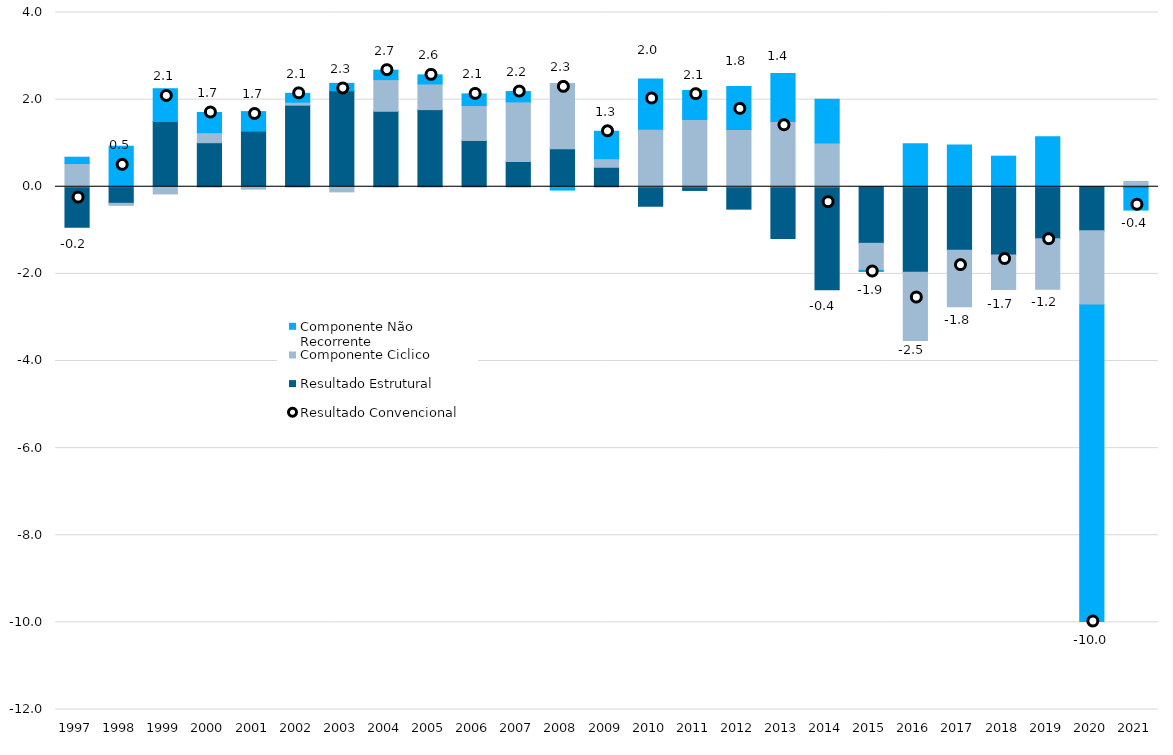
| Category | Resultado Estrutural | Componente Ciclico | Componente Não Recorrente |
|---|---|---|---|
| 1997.0 | -0.927 | 0.533 | 0.145 |
| 1998.0 | -0.38 | -0.047 | 0.93 |
| 1999.0 | 1.498 | -0.166 | 0.752 |
| 2000.0 | 1.011 | 0.23 | 0.462 |
| 2001.0 | 1.276 | -0.054 | 0.449 |
| 2002.0 | 1.873 | 0.068 | 0.203 |
| 2003.0 | 2.202 | -0.118 | 0.171 |
| 2004.0 | 1.732 | 0.727 | 0.216 |
| 2005.0 | 1.77 | 0.588 | 0.209 |
| 2006.0 | 1.063 | 0.801 | 0.267 |
| 2007.0 | 0.58 | 1.368 | 0.237 |
| 2008.0 | 0.875 | 1.495 | -0.077 |
| 2009.0 | 0.447 | 0.198 | 0.628 |
| 2010.0 | -0.447 | 1.319 | 1.154 |
| 2011.0 | -0.085 | 1.544 | 0.667 |
| 2012.0 | -0.514 | 1.314 | 0.988 |
| 2013.0 | -1.189 | 1.498 | 1.103 |
| 2014.0 | -2.363 | 1.004 | 1.005 |
| 2015.0 | -1.298 | -0.619 | -0.028 |
| 2016.0 | -1.961 | -1.57 | 0.988 |
| 2017.0 | -1.458 | -1.299 | 0.958 |
| 2018.0 | -1.568 | -0.792 | 0.702 |
| 2019.0 | -1.194 | -1.159 | 1.15 |
| 2020.0 | -1.01 | -1.702 | -7.268 |
| 2021.0 | -0.036 | 0.122 | -0.5 |